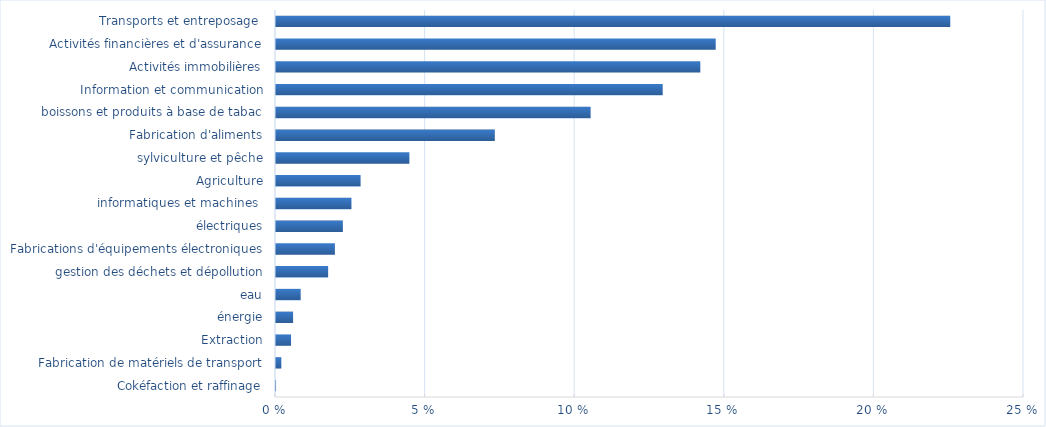
| Category | Total |
|---|---|
| Cokéfaction et raffinage | 0 |
| Fabrication de matériels de transport | 0.002 |
| Extraction, énergie, eau, gestion des déchets et dépollution | 0.005 |
| Fabrications d'équipements électroniques, électriques, informatiques et machines  | 0.006 |
| Agriculture, sylviculture et pêche | 0.008 |
| Fabrication d'aliments, boissons et produits à base de tabac | 0.017 |
| Information et communication | 0.02 |
| Activités immobilières | 0.022 |
| Activités financières et d'assurance | 0.025 |
| Transports et entreposage  | 0.028 |
| Fabrication autres produits industriels  | 0.045 |
| Administration publique, enseignement, santé et action sociale | 0.073 |
| Autres activités de services | 0.105 |
| Activités spécialisées, scientifiques et techniques, services admnistratifs et de soutien | 0.129 |
| Construction | 0.142 |
| Hébergement et restauration | 0.147 |
| Commerce | 0.225 |